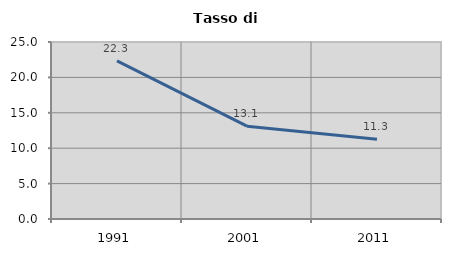
| Category | Tasso di disoccupazione   |
|---|---|
| 1991.0 | 22.325 |
| 2001.0 | 13.115 |
| 2011.0 | 11.275 |